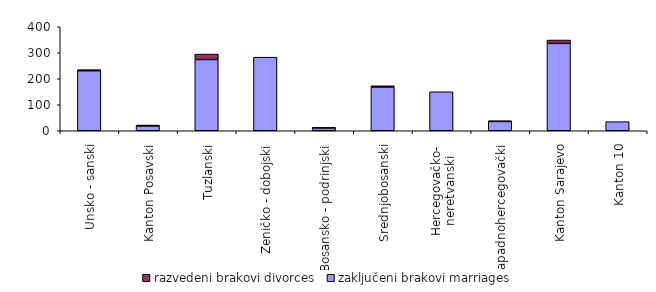
| Category | zaključeni brakovi marriages | razvedeni brakovi divorces |
|---|---|---|
| Unsko - sanski | 231 | 4 |
| Kanton Posavski | 18 | 4 |
| Tuzlanski | 274 | 21 |
| Zeničko - dobojski | 283 | 0 |
| Bosansko - podrinjski | 11 | 1 |
| Srednjobosanski | 168 | 5 |
| Hercegovačko-
neretvanski | 150 | 0 |
| Zapadnohercegovački | 36 | 2 |
| Kanton Sarajevo | 336 | 13 |
| Kanton 10 | 35 | 0 |